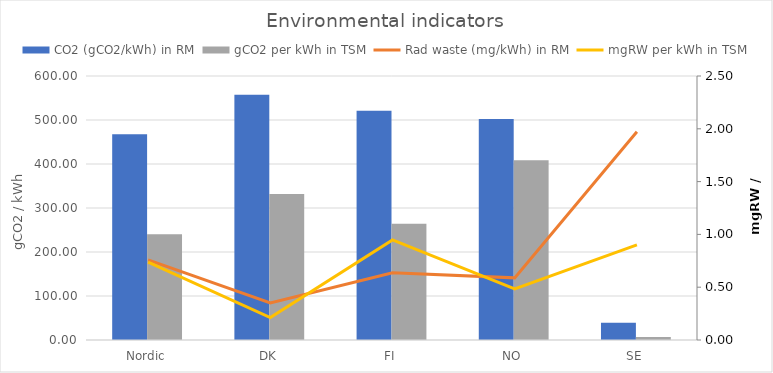
| Category | CO2 (gCO2/kWh) in RM | gCO2 per kWh in TSM |
|---|---|---|
| Nordic | 467.625 | 240.065 |
| DK | 557.395 | 331.764 |
| FI | 520.769 | 263.987 |
| NO | 502.306 | 408.63 |
| SE | 38.952 | 6.623 |